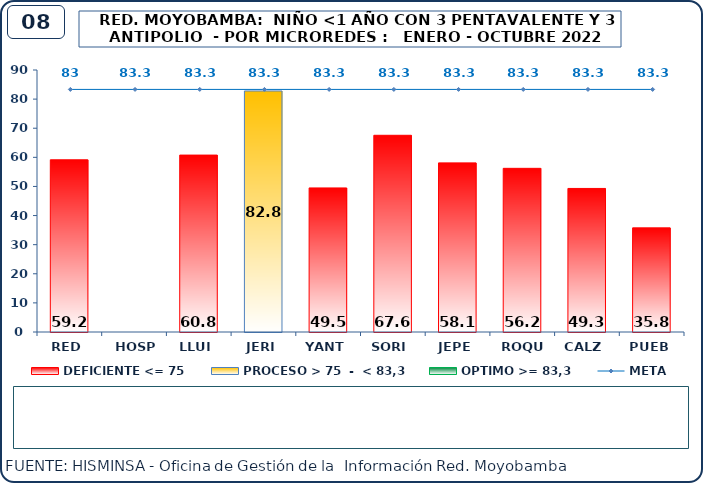
| Category | DEFICIENTE <= 75 | PROCESO > 75  -  < 83,3 | OPTIMO >= 83,3 |
|---|---|---|---|
| RED | 59.18 | 0 | 0 |
| HOSP | 0 | 0 | 0 |
| LLUI | 60.77 | 0 | 0 |
| JERI | 0 | 82.8 | 0 |
| YANT | 49.49 | 0 | 0 |
| SORI | 67.57 | 0 | 0 |
| JEPE | 58.1 | 0 | 0 |
| ROQU | 56.22 | 0 | 0 |
| CALZ | 49.31 | 0 | 0 |
| PUEB | 35.8 | 0 | 0 |